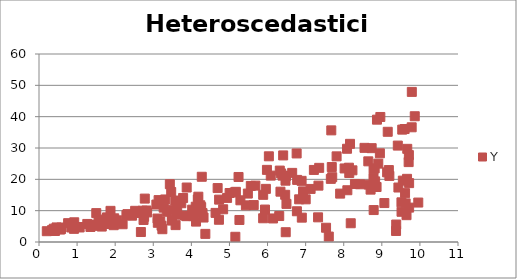
| Category | Y |
|---|---|
| 9.648642192100542 | 8.561 |
| 6.477431974715618 | 3.127 |
| 4.122504904979973 | 6.511 |
| 8.65789651237067 | 18.315 |
| 6.394418546506846 | 21.178 |
| 3.7358462371939916 | 12.375 |
| 7.697777770250375 | 20.676 |
| 5.168519092453091 | 16.016 |
| 8.13614877009431 | 23.715 |
| 4.834648155332538 | 10.446 |
| 7.686318781463672 | 23.922 |
| 3.081461424400823 | 11.949 |
| 8.824377837555645 | 19.349 |
| 1.73953712341819 | 5.745 |
| 3.2172531673515703 | 5.201 |
| 3.877506611127892 | 17.385 |
| 5.984131949788683 | 23.02 |
| 9.435494475988142 | 17.385 |
| 9.155181949398077 | 35.175 |
| 1.9602846425463905 | 5.356 |
| 8.294381715810848 | 18.523 |
| 9.139825429980107 | 22.229 |
| 2.839145286775482 | 9.435 |
| 9.704554781608746 | 25.501 |
| 0.7643066466150061 | 6.012 |
| 5.636640045149239 | 11.788 |
| 2.691317951482317 | 9.287 |
| 6.410180324116163 | 27.633 |
| 1.2675520484317615 | 5.764 |
| 0.8963554536700946 | 5.318 |
| 3.4890869196640804 | 6.879 |
| 8.165213552599372 | 31.331 |
| 5.129878364652603 | 15.812 |
| 8.08682028045249 | 29.757 |
| 0.917634714140585 | 4.195 |
| 9.536185416901523 | 35.862 |
| 3.1194761084602343 | 6.131 |
| 1.7855071139545986 | 7.853 |
| 9.517596231419043 | 9.647 |
| 6.306760203927598 | 8.284 |
| 8.428655617396684 | 18.423 |
| 6.034733338007138 | 27.347 |
| 8.145180385118424 | 22.016 |
| 7.355650558533685 | 23.663 |
| 4.68961156034433 | 17.213 |
| 7.673413381053828 | 35.629 |
| 1.0425658739324029 | 4.77 |
| 8.645346442599282 | 25.746 |
| 4.9376451645904895 | 14.07 |
| 2.674994248574575 | 3.185 |
| 3.1399078007210344 | 13.373 |
| 8.545766138267295 | 30.046 |
| 5.238295083008739 | 20.751 |
| 3.5778273213388556 | 13.239 |
| 6.770513413328116 | 9.81 |
| 1.648014915151228 | 4.926 |
| 9.668058632067147 | 29.734 |
| 7.216360679068209 | 22.997 |
| 3.783627300576037 | 14.049 |
| 3.4894888901499344 | 6.929 |
| 5.4315821059863865 | 11.701 |
| 5.884764195901894 | 7.572 |
| 2.3213963501846804 | 8.898 |
| 9.419595727020294 | 30.768 |
| 1.4320121600620106 | 5.181 |
| 8.022788079548178 | 23.473 |
| 3.4346666856949684 | 18.449 |
| 6.471567695087752 | 19.57 |
| 3.628177610814338 | 10.811 |
| 1.5035305103280294 | 9.218 |
| 2.745024053070911 | 7.033 |
| 2.295206997181505 | 8.584 |
| 9.373803872818918 | 3.516 |
| 7.812993396502921 | 27.335 |
| 9.956938385440768 | 12.589 |
| 3.605673979346431 | 9.143 |
| 6.646633203369985 | 22.061 |
| 0.5883761623731987 | 4.625 |
| 9.66213424568862 | 20.157 |
| 4.635007199459695 | 9.289 |
| 9.716515217161353 | 18.79 |
| 5.9564163421014324 | 16.956 |
| 1.5824088205308129 | 5.384 |
| 9.610058289187238 | 15.596 |
| 8.812956833532578 | 23.483 |
| 6.321250190859384 | 22.792 |
| 8.095334290882906 | 16.519 |
| 4.29323909710479 | 9.222 |
| 6.829518285189568 | 13.619 |
| 0.3874386624884818 | 4.248 |
| 9.598411891848379 | 36.057 |
| 2.4429739187719934 | 8.4 |
| 6.932612284728101 | 16.154 |
| 5.0037567860431125 | 15.637 |
| 0.5570304923491098 | 3.968 |
| 9.06693596216259 | 12.429 |
| 1.9661240387713053 | 6.045 |
| 1.0671235491849307 | 4.647 |
| 3.5125513529833152 | 10.314 |
| 2.5236946534901064 | 9.951 |
| 9.710726116493198 | 27.732 |
| 5.932794745837857 | 10.353 |
| 3.585876511799259 | 5.39 |
| 2.72248301571433 | 9.99 |
| 8.949028483693443 | 28.308 |
| 8.872742584651117 | 39.044 |
| 4.728159326005602 | 13.521 |
| 7.66171364310694 | 20.149 |
| 8.228751047600243 | 22.876 |
| 7.905853629965138 | 15.442 |
| 6.4629365433738855 | 15.07 |
| 9.551767352565003 | 19.584 |
| 1.973899934028417 | 7.559 |
| 1.892367291218895 | 6.157 |
| 7.001540770615841 | 13.616 |
| 7.33646350958673 | 17.989 |
| 1.4781499362737904 | 5.332 |
| 3.2725169348493988 | 10.958 |
| 4.31956605807693 | 7.806 |
| 6.084454878969106 | 21.184 |
| 8.785984683861107 | 10.197 |
| 0.41914934369046697 | 3.512 |
| 2.7600804228806486 | 8.057 |
| 2.0559070326694897 | 6.919 |
| 6.8939231766914455 | 19.516 |
| 3.619093051194758 | 8.694 |
| 6.496530077961226 | 12.161 |
| 9.198177494987032 | 21.09 |
| 0.42608019259510743 | 3.902 |
| 9.625044322937592 | 12.317 |
| 5.885217519744707 | 15.057 |
| 4.021545372107576 | 10.322 |
| 6.777215734079563 | 19.82 |
| 9.78752917970089 | 47.904 |
| 4.367411280209646 | 2.592 |
| 1.3506017459420094 | 4.793 |
| 7.536199847278126 | 4.552 |
| 5.154638536158017 | 1.662 |
| 6.485085812342806 | 21.08 |
| 4.235171709465334 | 11.719 |
| 3.3543152628986403 | 9.648 |
| 0.4597066797627647 | 4.652 |
| 9.716596870879371 | 10.975 |
| 4.182839456241054 | 14.458 |
| 2.8210801563625534 | 10.057 |
| 9.515172604668532 | 12.66 |
| 1.8772640906026028 | 9.939 |
| 5.48348586929378 | 15.454 |
| 9.864568683994339 | 40.136 |
| 0.3414893151204912 | 3.785 |
| 4.100200710279552 | 9.371 |
| 7.326527553026139 | 7.874 |
| 4.048509337770221 | 8.266 |
| 3.470353395521961 | 15.961 |
| 5.680862963971725 | 17.992 |
| 8.961084353257494 | 39.903 |
| 0.2049371597315186 | 3.448 |
| 4.163991188020724 | 10.385 |
| 2.1951742163928434 | 5.669 |
| 8.733236639261602 | 29.949 |
| 6.3564193225566 | 21.885 |
| 1.5636780728231092 | 6.338 |
| 4.723999838606428 | 7.098 |
| 8.183996169404965 | 5.985 |
| 4.257868808991984 | 11.123 |
| 9.184748430203868 | 22.956 |
| 3.2387310168244876 | 4.082 |
| 4.273236471252426 | 20.816 |
| 0.9486367893006364 | 4.75 |
| 0.9248710667173266 | 6.291 |
| 3.8739138737522136 | 8.24 |
| 3.311935212301673 | 13.576 |
| 2.777377151467407 | 13.848 |
| 9.377733764411106 | 5.573 |
| 3.1834616856245956 | 6.567 |
| 0.8500504808086462 | 4.625 |
| 3.835521417555363 | 8.425 |
| 5.5606221998890994 | 17.89 |
| 8.705122172527238 | 16.715 |
| 5.28715889356869 | 13.305 |
| 4.115109923443442 | 11.259 |
| 8.781953049151385 | 20.456 |
| 8.784117293391127 | 23.363 |
| 1.3507309886808894 | 5.529 |
| 1.7289889915796153 | 7.169 |
| 7.130342403504702 | 16.936 |
| 0.5798053461820818 | 4.142 |
| 8.90684784574609 | 25.009 |
| 6.144045768149324 | 7.512 |
| 8.862156538244097 | 17.55 |
| 4.169110301662857 | 13.58 |
| 6.339060230304391 | 16.061 |
| 3.111760049851904 | 7.486 |
| 9.784055138271704 | 36.61 |
| 7.607849854762384 | 1.735 |
| 2.594020464080422 | 9.339 |
| 5.262075398919091 | 7.03 |
| 6.899671534373468 | 7.773 |
| 6.763977186409001 | 28.26 |